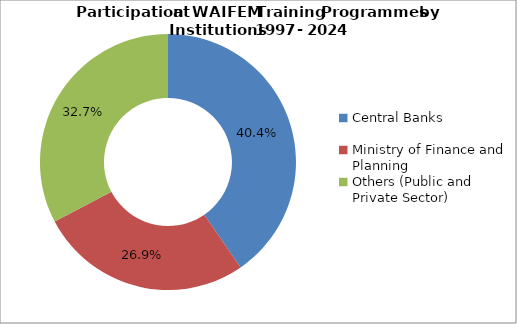
| Category | Series 0 |
|---|---|
| Central Banks | 0.404 |
| Ministry of Finance and Planning | 0.269 |
| Others (Public and Private Sector) | 0.327 |